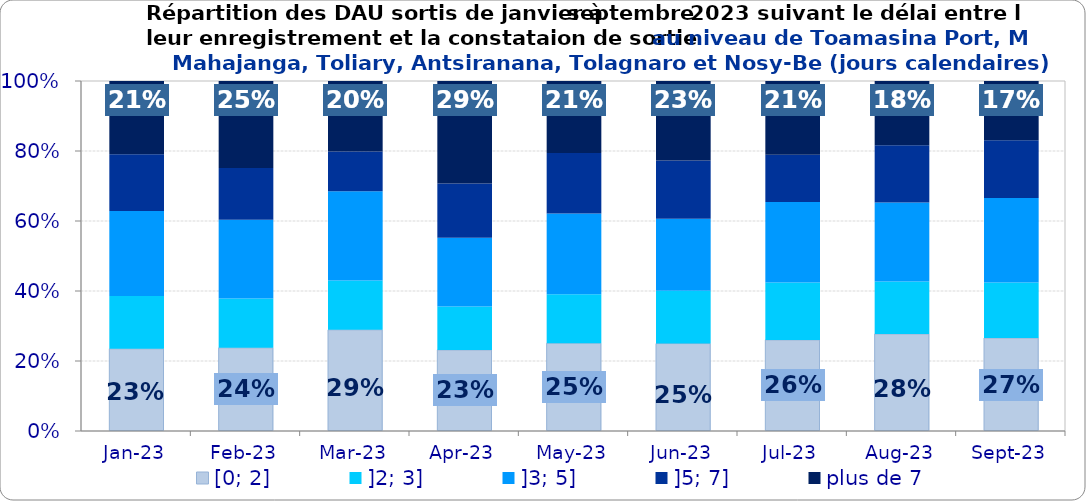
| Category | [0; 2] | ]2; 3] | ]3; 5] | ]5; 7] | plus de 7 |
|---|---|---|---|---|---|
| 2023-01-01 | 0.235 | 0.151 | 0.243 | 0.162 | 0.21 |
| 2023-02-01 | 0.238 | 0.141 | 0.225 | 0.148 | 0.248 |
| 2023-03-01 | 0.289 | 0.141 | 0.255 | 0.114 | 0.201 |
| 2023-04-01 | 0.231 | 0.124 | 0.196 | 0.155 | 0.293 |
| 2023-05-01 | 0.251 | 0.14 | 0.23 | 0.173 | 0.205 |
| 2023-06-01 | 0.25 | 0.151 | 0.206 | 0.167 | 0.227 |
| 2023-07-01 | 0.26 | 0.164 | 0.229 | 0.135 | 0.211 |
| 2023-08-01 | 0.277 | 0.15 | 0.226 | 0.164 | 0.183 |
| 2023-09-01 | 0.266 | 0.159 | 0.241 | 0.165 | 0.169 |